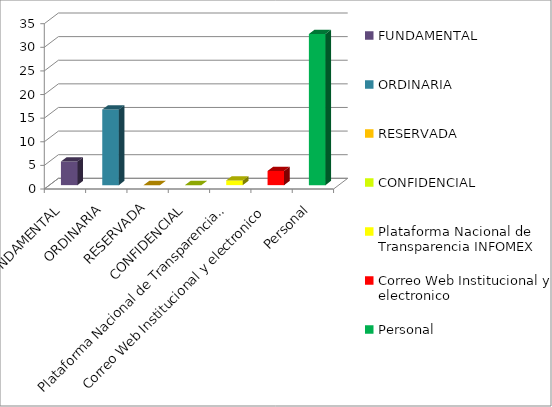
| Category | Series 2 |
|---|---|
| FUNDAMENTAL | 5 |
| ORDINARIA | 16 |
| RESERVADA | 0 |
| CONFIDENCIAL | 0 |
| Plataforma Nacional de Transparencia INFOMEX | 1 |
| Correo Web Institucional y electronico | 3 |
| Personal | 32 |